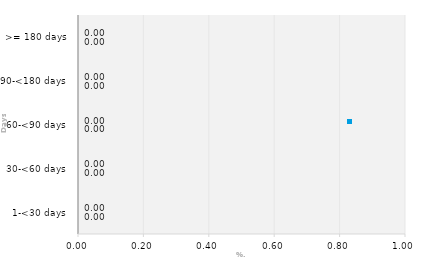
| Category | Public | Series 0 |
|---|---|---|
| 1-<30 days | 0 |  |
| 30-<60 days | 0 |  |
| 60-<90 days | 0 |  |
| 90-<180 days | 0 |  |
| >= 180 days | 0 |  |